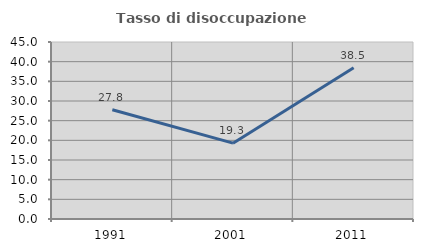
| Category | Tasso di disoccupazione giovanile  |
|---|---|
| 1991.0 | 27.778 |
| 2001.0 | 19.277 |
| 2011.0 | 38.462 |